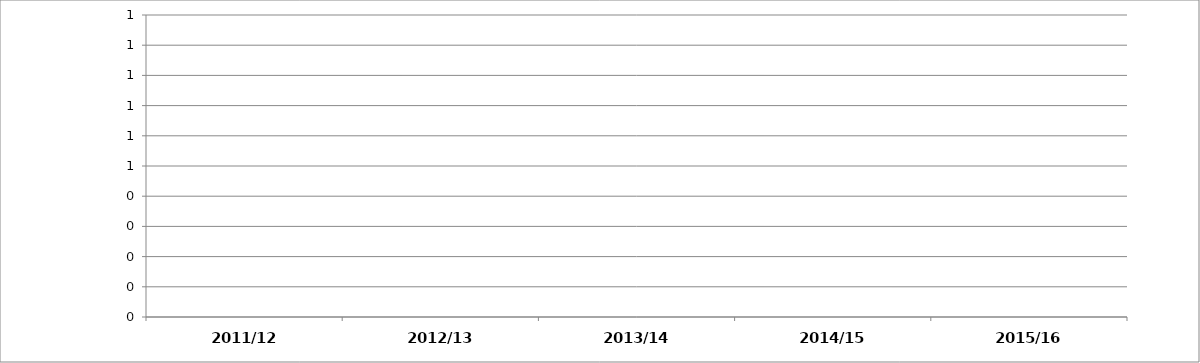
| Category | Series 0 |
|---|---|
| 2011/12 | 0 |
| 2012/13 | 0 |
| 2013/14 | 0 |
| 2014/15 | 0 |
| 2015/16 | 0 |